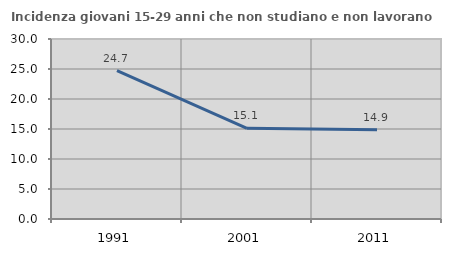
| Category | Incidenza giovani 15-29 anni che non studiano e non lavorano  |
|---|---|
| 1991.0 | 24.744 |
| 2001.0 | 15.11 |
| 2011.0 | 14.86 |